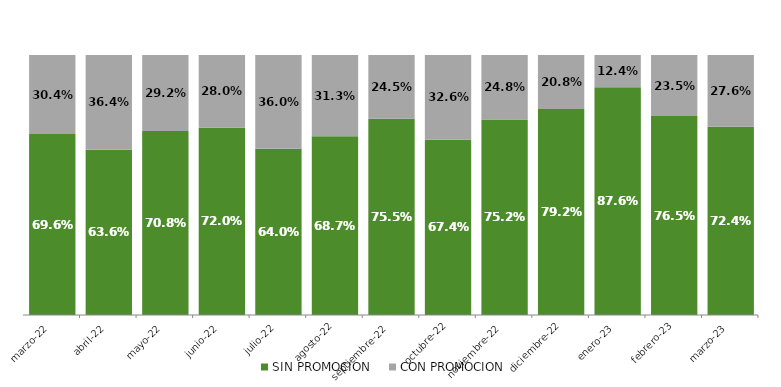
| Category | SIN PROMOCION   | CON PROMOCION   |
|---|---|---|
| 2022-03-01 | 0.696 | 0.304 |
| 2022-04-01 | 0.636 | 0.364 |
| 2022-05-01 | 0.708 | 0.292 |
| 2022-06-01 | 0.72 | 0.28 |
| 2022-07-01 | 0.64 | 0.36 |
| 2022-08-01 | 0.687 | 0.313 |
| 2022-09-01 | 0.755 | 0.245 |
| 2022-10-01 | 0.674 | 0.326 |
| 2022-11-01 | 0.752 | 0.248 |
| 2022-12-01 | 0.792 | 0.208 |
| 2023-01-01 | 0.876 | 0.124 |
| 2023-02-01 | 0.765 | 0.235 |
| 2023-03-01 | 0.724 | 0.276 |